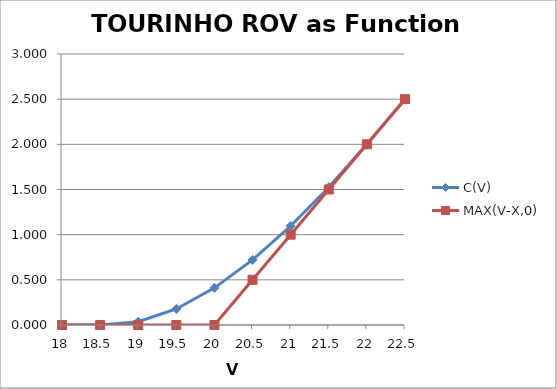
| Category | C(V) | MAX(V-X,0) |
|---|---|---|
| 18.0 | 0 | 0 |
| 18.5 | 0 | 0 |
| 19.0 | 0.036 | 0 |
| 19.5 | 0.178 | 0 |
| 20.0 | 0.411 | 0 |
| 20.5 | 0.721 | 0.5 |
| 21.0 | 1.096 | 1 |
| 21.5 | 1.525 | 1.5 |
| 22.0 | 2 | 2 |
| 22.5 | 2.5 | 2.5 |